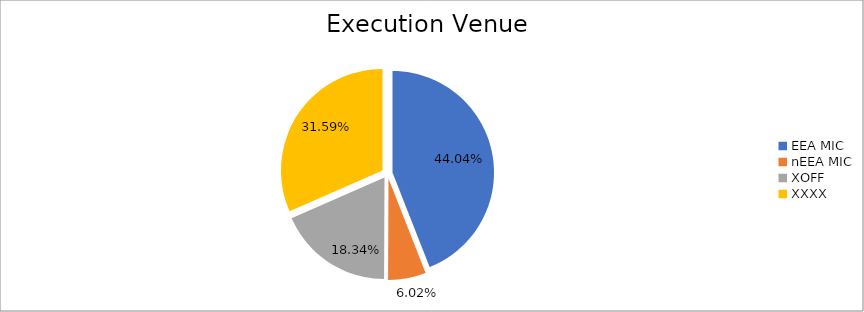
| Category | Series 0 |
|---|---|
| EEA MIC | 5788409.275 |
| nEEA MIC | 791643.042 |
| XOFF | 2410533.689 |
| XXXX | 4152513.232 |